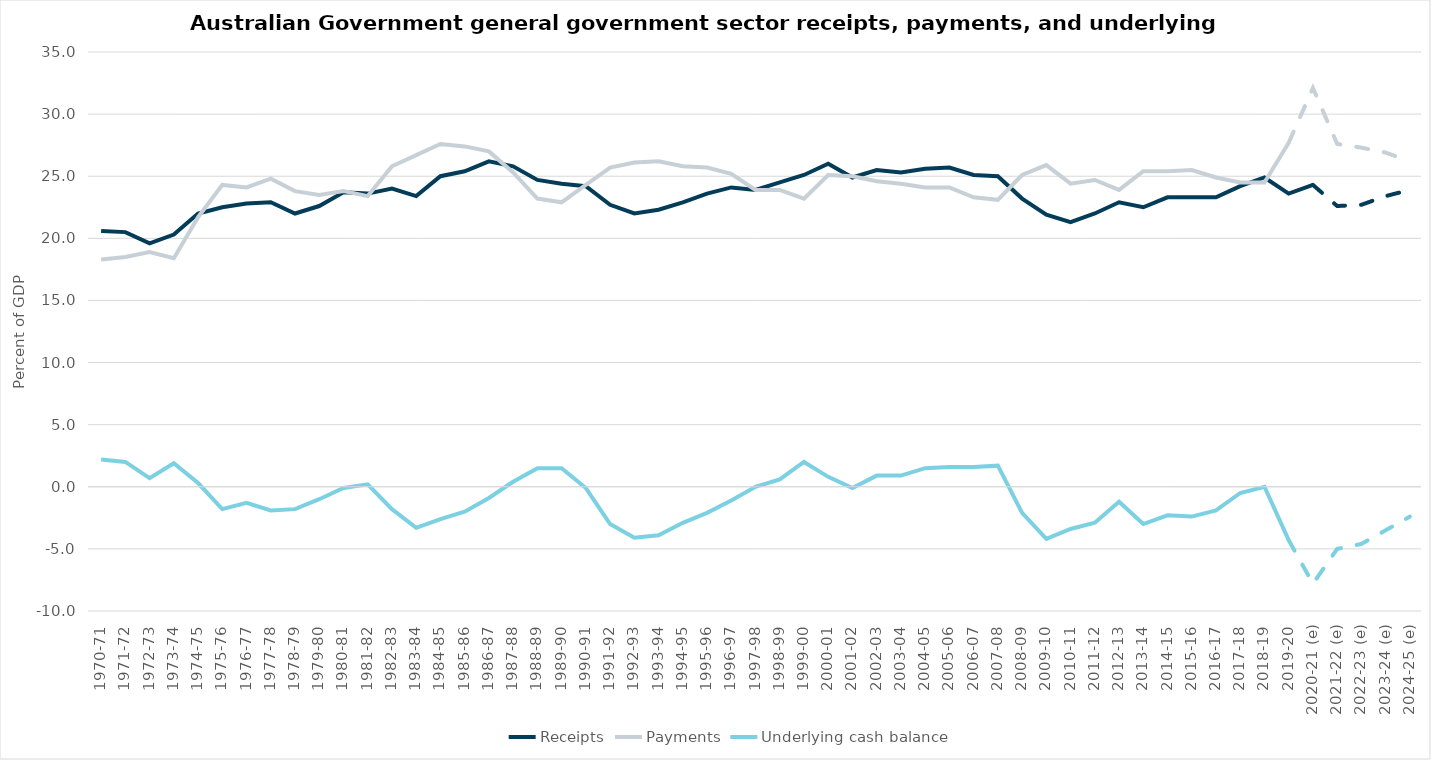
| Category | Receipts | Payments | Underlying cash balance |
|---|---|---|---|
| 1970-71 | 20.6 | 18.3 | 2.2 |
| 1971-72 | 20.5 | 18.5 | 2 |
| 1972-73 | 19.6 | 18.9 | 0.7 |
| 1973-74 | 20.3 | 18.4 | 1.9 |
| 1974-75 | 22 | 21.7 | 0.3 |
| 1975-76 | 22.5 | 24.3 | -1.8 |
| 1976-77 | 22.8 | 24.1 | -1.3 |
| 1977-78 | 22.9 | 24.8 | -1.9 |
| 1978-79 | 22 | 23.8 | -1.8 |
| 1979-80 | 22.6 | 23.5 | -1 |
| 1980-81 | 23.7 | 23.8 | -0.1 |
| 1981-82 | 23.6 | 23.4 | 0.2 |
| 1982-83 | 24 | 25.8 | -1.8 |
| 1983-84 | 23.4 | 26.7 | -3.3 |
| 1984-85 | 25 | 27.6 | -2.6 |
| 1985-86 | 25.4 | 27.4 | -2 |
| 1986-87 | 26.2 | 27 | -0.9 |
| 1987-88 | 25.8 | 25.3 | 0.4 |
| 1988-89 | 24.7 | 23.2 | 1.5 |
| 1989-90 | 24.4 | 22.9 | 1.5 |
| 1990-91 | 24.2 | 24.3 | -0.1 |
| 1991-92 | 22.7 | 25.7 | -3 |
| 1992-93 | 22 | 26.1 | -4.1 |
| 1993-94 | 22.3 | 26.2 | -3.9 |
| 1994-95 | 22.9 | 25.8 | -2.9 |
| 1995-96 | 23.6 | 25.7 | -2.1 |
| 1996-97 | 24.1 | 25.2 | -1.1 |
| 1997-98 | 23.9 | 23.9 | 0 |
| 1998-99 | 24.5 | 23.9 | 0.6 |
| 1999-00 | 25.1 | 23.2 | 2 |
| 2000-01 | 26 | 25.1 | 0.8 |
| 2001-02 | 24.9 | 25 | -0.1 |
| 2002-03 | 25.5 | 24.6 | 0.9 |
| 2003-04 | 25.3 | 24.4 | 0.9 |
| 2004-05 | 25.6 | 24.1 | 1.5 |
| 2005-06 | 25.7 | 24.1 | 1.6 |
| 2006-07 | 25.1 | 23.3 | 1.6 |
| 2007-08 | 25 | 23.1 | 1.7 |
| 2008-09 | 23.2 | 25.1 | -2.1 |
| 2009-10 | 21.9 | 25.9 | -4.2 |
| 2010-11 | 21.3 | 24.4 | -3.4 |
| 2011-12 | 22 | 24.7 | -2.9 |
| 2012-13 | 22.9 | 23.9 | -1.2 |
| 2013-14 | 22.5 | 25.4 | -3 |
| 2014-15 | 23.3 | 25.4 | -2.3 |
| 2015-16 | 23.3 | 25.5 | -2.4 |
| 2016-17 | 23.3 | 24.9 | -1.9 |
| 2017-18 | 24.2 | 24.5 | -0.5 |
| 2018-19 | 24.9 | 24.5 | 0 |
| 2019-20 | 23.6 | 27.7 | -4.3 |
| 2020-21 (e) | 24.3 | 32.1 | -7.8 |
| 2021-22 (e) | 22.6 | 27.6 | -5 |
| 2022-23 (e) | 22.7 | 27.3 | -4.6 |
| 2023-24 (e) | 23.4 | 26.9 | -3.5 |
| 2024-25 (e) | 23.9 | 26.2 | -2.4 |